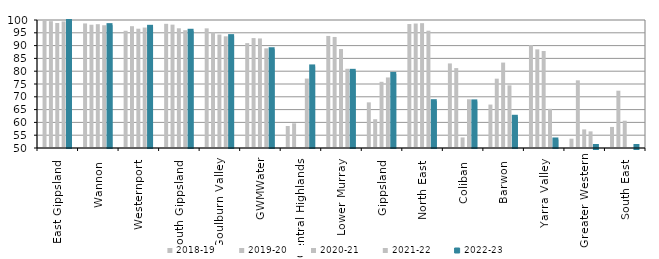
| Category | 2018-19 | 2019-20 | 2020-21 | 2021-22 | 2022-23 |
|---|---|---|---|---|---|
| East Gippsland  | 99.831 | 99.54 | 98.821 | 99.444 | 99.651 |
| Wannon  | 98.658 | 98.15 | 98.365 | 97.952 | 97.993 |
| Westernport  | 95.791 | 97.579 | 96.603 | 97.048 | 97.338 |
| South Gippsland  | 98.505 | 98.19 | 96.761 | 96.001 | 95.793 |
| Goulburn Valley  | 96.738 | 95.253 | 94.321 | 93.626 | 93.697 |
| GWMWater | 90.971 | 92.934 | 92.794 | 88.927 | 88.577 |
| Central Highlands  | 58.589 | 59.649 | 46.368 | 77.123 | 81.865 |
| Lower Murray  | 93.771 | 93.377 | 88.658 | 80.954 | 80.145 |
| Gippsland  | 67.828 | 61.241 | 75.857 | 77.562 | 78.94 |
| North East  | 98.421 | 98.621 | 98.759 | 95.826 | 68.284 |
| Coliban  | 83.033 | 81.213 | 54.13 | 69.033 | 68.205 |
| Barwon  | 66.971 | 77.09 | 83.37 | 74.478 | 62.197 |
| Yarra Valley  | 90.179 | 88.523 | 87.888 | 65.299 | 53.33 |
| Greater Western | 53.638 | 76.431 | 57.271 | 56.496 | 37.854 |
| South East  | 58.229 | 72.379 | 60.66 | 41.506 | 34.961 |